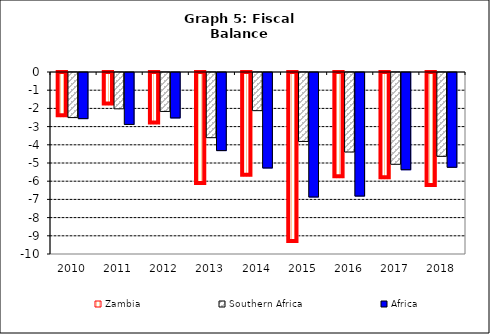
| Category | Zambia | Southern Africa | Africa |
|---|---|---|---|
| 2010.0 | -2.432 | -2.477 | -2.535 |
| 2011.0 | -1.783 | -1.995 | -2.853 |
| 2012.0 | -2.832 | -2.14 | -2.495 |
| 2013.0 | -6.151 | -3.581 | -4.291 |
| 2014.0 | -5.705 | -2.096 | -5.245 |
| 2015.0 | -9.338 | -3.788 | -6.84 |
| 2016.0 | -5.781 | -4.368 | -6.79 |
| 2017.0 | -5.844 | -5.043 | -5.342 |
| 2018.0 | -6.262 | -4.606 | -5.208 |